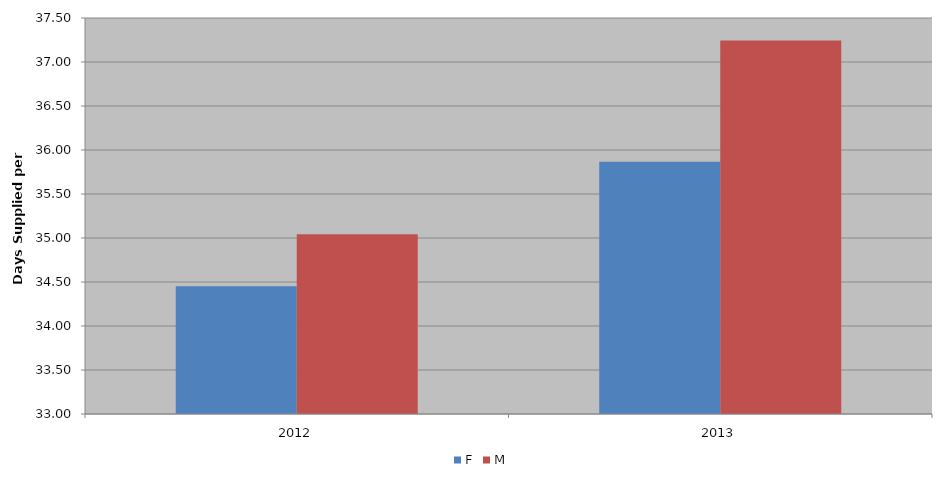
| Category | F | M |
|---|---|---|
| 2012 | 34.453 | 35.043 |
| 2013 | 35.865 | 37.243 |